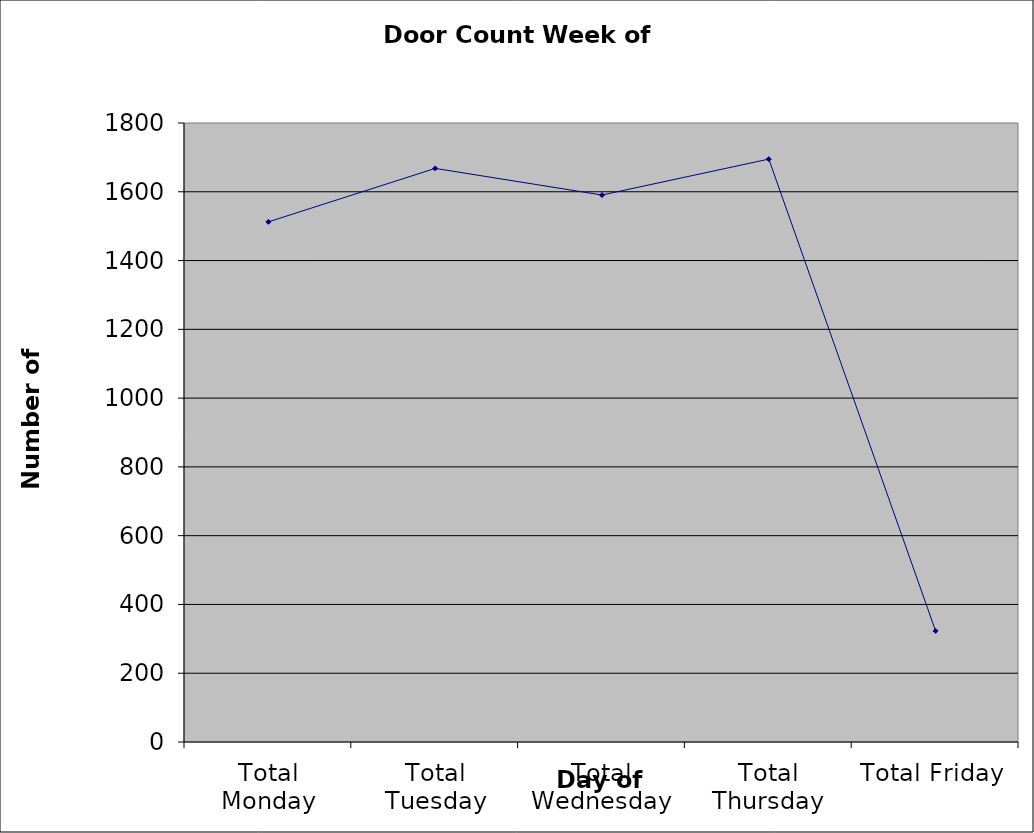
| Category | Series 0 |
|---|---|
| Total Monday | 1512.5 |
| Total Tuesday | 1668 |
| Total Wednesday | 1590.5 |
| Total Thursday | 1695 |
| Total Friday | 323 |